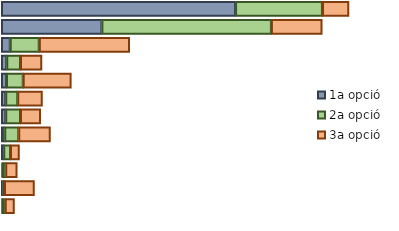
| Category | 1a opció | 2a opció | 3a opció |
|---|---|---|---|
| 0 | 63.098 | 23.403 | 7.073 |
| 1 | 27.06 | 45.692 | 13.638 |
| 2 | 2.343 | 7.858 | 24.301 |
| 3 | 1.426 | 3.686 | 5.757 |
| 4 | 1.322 | 4.532 | 12.907 |
| 5 | 1.173 | 3.232 | 6.567 |
| 6 | 1.161 | 3.988 | 5.389 |
| 7 | 0.859 | 3.76 | 8.552 |
| 8 | 0.615 | 1.79 | 2.402 |
| 9 | 0.256 | 0.903 | 3.049 |
| 10 | 0.484 | 0.345 | 7.964 |
| 11 | 0.203 | 0.81 | 2.4 |